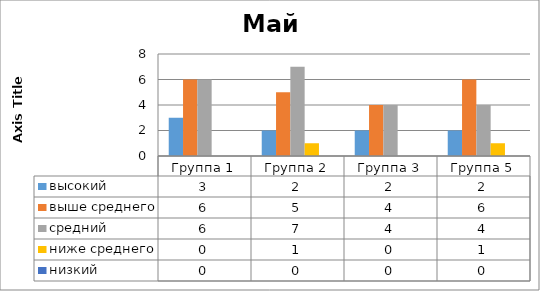
| Category | высокий | выше среднего | средний | ниже среднего | низкий |
|---|---|---|---|---|---|
| Группа 1 | 3 | 6 | 6 | 0 | 0 |
| Группа 2 | 2 | 5 | 7 | 1 | 0 |
| Группа 3 | 2 | 4 | 4 | 0 | 0 |
| Группа 5 | 2 | 6 | 4 | 1 | 0 |